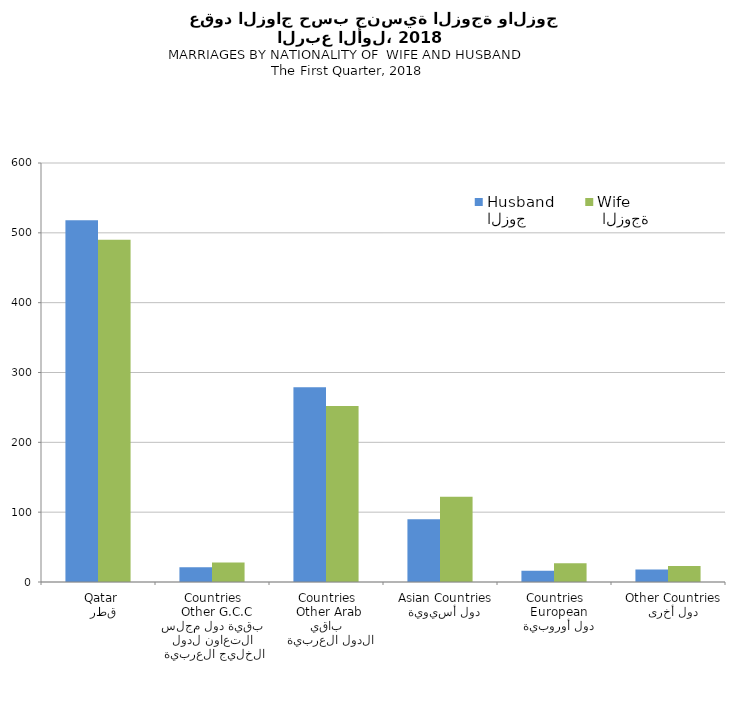
| Category | الزوج
Husband |  الزوجة
Wife |
|---|---|---|
|   قطر
 Qatar | 518 | 490 |
|  بقية دول مجلس التعاون لدول الخليج العربية
  Other G.C.C Countries | 21 | 28 |
|   باقي الدول العربية
 Other Arab Countries | 279 | 252 |
|   دول أسيوية
  Asian Countries | 90 | 122 |
|   دول أوروبية
  European Countries | 16 | 27 |
|   دول أخرى
  Other Countries | 18 | 23 |